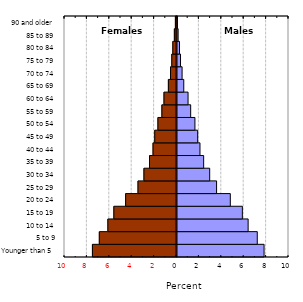
| Category | Series 0 |
|---|---|
| Younger than 5 | 7.774 |
| 5 to 9 | 7.167 |
| 10 to 14 | 6.351 |
| 15 to 19 | 5.836 |
| 20 to 24 | 4.761 |
| 25 to 29 | 3.535 |
| 30 to 34 | 2.919 |
| 35 to 39 | 2.381 |
| 40 to 44 | 2.052 |
| 45 to 49 | 1.845 |
| 50 to 54 | 1.601 |
| 55 to 59 | 1.221 |
| 60 to 64 | 0.988 |
| 65 to 69 | 0.605 |
| 70 to 74 | 0.454 |
| 75 to 79 | 0.314 |
| 80 to 84 | 0.222 |
| 85 to 89 | 0.101 |
| 90 and older | 0.044 |